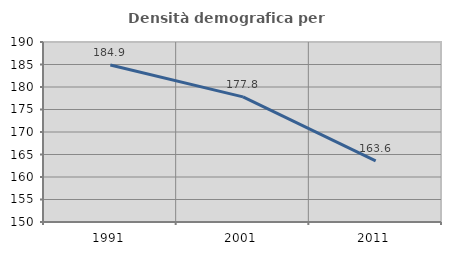
| Category | Densità demografica |
|---|---|
| 1991.0 | 184.896 |
| 2001.0 | 177.796 |
| 2011.0 | 163.597 |